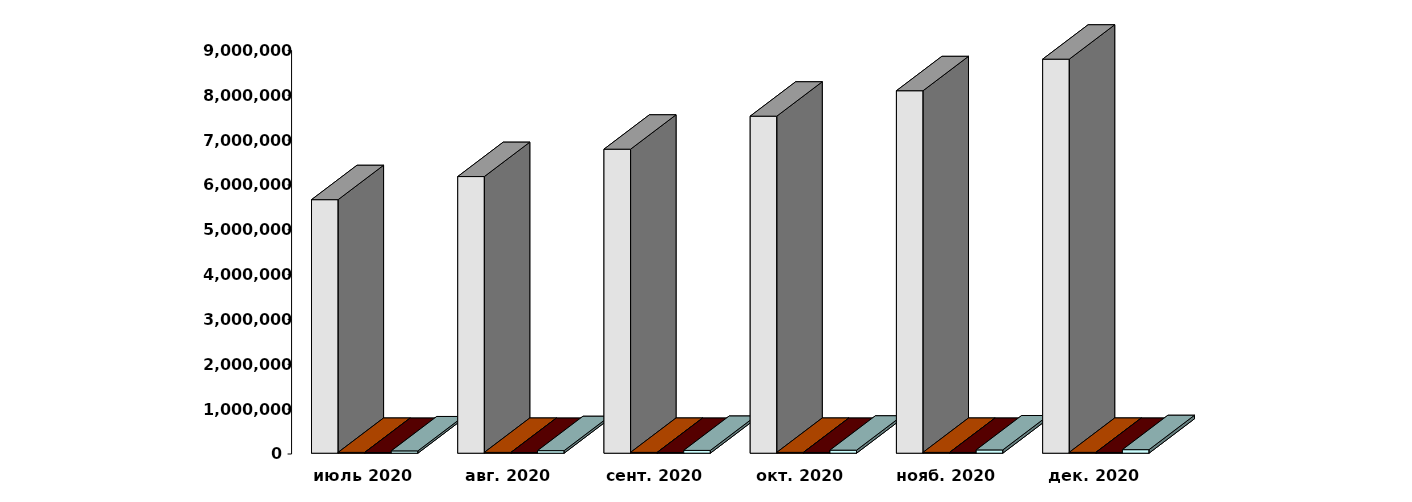
| Category | Физические лица | Юридические лица | Иностранные лица | Клиенты, передавшие свои средства в ДУ |
|---|---|---|---|---|
| 2020-07-30 | 5653690 | 18250 | 16100 | 51872 |
| 2020-08-30 | 6169141 | 18285 | 16204 | 57089 |
| 2020-09-30 | 6779757 | 18484 | 16494 | 62564 |
| 2020-10-30 | 7515934 | 18680 | 16861 | 67792 |
| 2020-11-30 | 8083085 | 18780 | 17081 | 73469 |
| 2020-12-31 | 8787077 | 19014 | 17268 | 79270 |